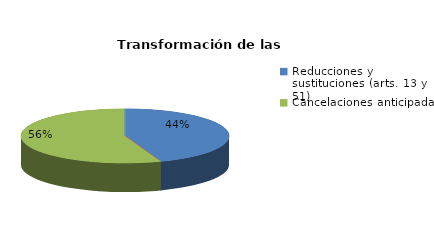
| Category | Series 0 |
|---|---|
| Reducciones y sustituciones (arts. 13 y 51) | 4 |
| Por quebrantamiento (art. 50.2) | 0 |
| Cancelaciones anticipadas | 5 |
| Traslado a Centros Penitenciarios | 0 |
| Conversión internamientos en cerrados (art. 51.2) | 0 |